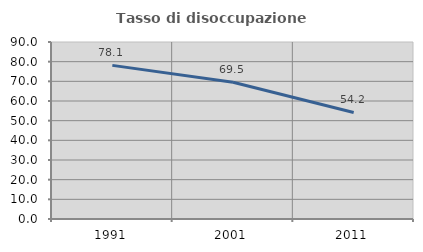
| Category | Tasso di disoccupazione giovanile  |
|---|---|
| 1991.0 | 78.112 |
| 2001.0 | 69.535 |
| 2011.0 | 54.167 |